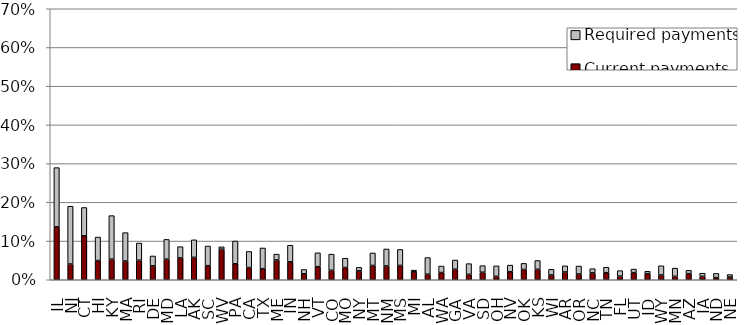
| Category | Current payments | Required payments |
|---|---|---|
| IL | 0.137 | 0.153 |
| NJ | 0.041 | 0.149 |
| CT | 0.114 | 0.073 |
| HI | 0.05 | 0.061 |
| KY | 0.053 | 0.112 |
| MA | 0.048 | 0.073 |
| RI | 0.05 | 0.045 |
| DE | 0.036 | 0.026 |
| MD | 0.053 | 0.051 |
| LA | 0.056 | 0.029 |
| AK | 0.058 | 0.045 |
| SC | 0.036 | 0.051 |
| WV | 0.079 | 0.006 |
| PA | 0.041 | 0.059 |
| CA | 0.032 | 0.041 |
| TX | 0.029 | 0.053 |
| ME | 0.051 | 0.015 |
| IN | 0.046 | 0.043 |
| NH | 0.016 | 0.011 |
| VT | 0.034 | 0.036 |
| CO | 0.024 | 0.042 |
| MO | 0.032 | 0.024 |
| NY | 0.023 | 0.009 |
| MT | 0.037 | 0.032 |
| NM | 0.036 | 0.044 |
| MS | 0.037 | 0.041 |
| MI | 0.02 | 0.004 |
| AL | 0.014 | 0.043 |
| WA | 0.019 | 0.017 |
| GA | 0.027 | 0.024 |
| VA | 0.014 | 0.028 |
| SD | 0.019 | 0.017 |
| OH | 0.009 | 0.027 |
| NV | 0.021 | 0.017 |
| OK | 0.027 | 0.016 |
| KS | 0.027 | 0.023 |
| WI | 0.012 | 0.014 |
| AR | 0.02 | 0.016 |
| OR | 0.015 | 0.02 |
| NC | 0.018 | 0.011 |
| TN | 0.018 | 0.014 |
| FL | 0.009 | 0.014 |
| UT | 0.018 | 0.009 |
| ID | 0.016 | 0.006 |
| WY | 0.012 | 0.024 |
| MN | 0.009 | 0.021 |
| AZ | 0.016 | 0.008 |
| IA | 0.009 | 0.008 |
| ND | 0.006 | 0.011 |
| NE | 0.007 | 0.006 |